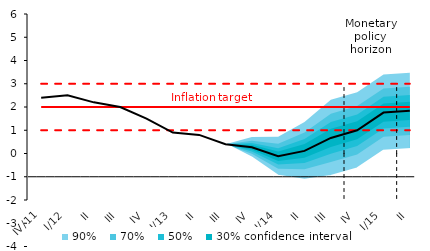
| Category | Inflation Target | Inflation Target - lower bound | Inflation Target - upper bound | Střed předpovědi |
|---|---|---|---|---|
| IV/11 | 2 | 1 | 3 | 2.4 |
| I/12 | 2 | 1 | 3 | 2.5 |
| II | 2 | 1 | 3 | 2.2 |
| III | 2 | 1 | 3 | 2 |
| IV | 2 | 1 | 3 | 1.5 |
| I/13 | 2 | 1 | 3 | 0.9 |
| II | 2 | 1 | 3 | 0.8 |
| III | 2 | 1 | 3 | 0.4 |
| IV | 2 | 1 | 3 | 0.269 |
| I/14 | 2 | 1 | 3 | -0.119 |
| II | 2 | 1 | 3 | 0.111 |
| III | 2 | 1 | 3 | 0.67 |
| IV | 2 | 1 | 3 | 1 |
| I/15 | 2 | 1 | 3 | 1.76 |
| II | 2 | 1 | 3 | 1.835 |